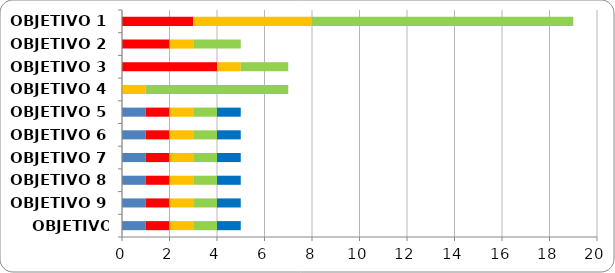
| Category | Series 0 | Series 1 | Series 2 | Series 3 | Series 4 |
|---|---|---|---|---|---|
| OBJETIVO 1 | 0 | 3 | 5 | 11 | 0 |
| OBJETIVO 2 | 0 | 2 | 1 | 2 | 0 |
| OBJETIVO 3 | 0 | 4 | 1 | 2 | 0 |
| OBJETIVO 4 | 0 | 0 | 1 | 6 | 0 |
| OBJETIVO 5 | 1 | 1 | 1 | 1 | 1 |
| OBJETIVO 6 | 1 | 1 | 1 | 1 | 1 |
| OBJETIVO 7 | 1 | 1 | 1 | 1 | 1 |
| OBJETIVO 8 | 1 | 1 | 1 | 1 | 1 |
| OBJETIVO 9 | 1 | 1 | 1 | 1 | 1 |
| OBJETIVO 10 | 1 | 1 | 1 | 1 | 1 |